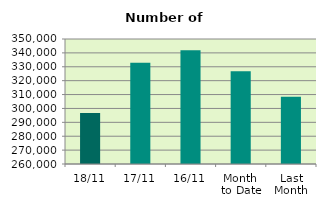
| Category | Series 0 |
|---|---|
| 18/11 | 296660 |
| 17/11 | 332924 |
| 16/11 | 341826 |
| Month 
to Date | 326771.143 |
| Last
Month | 308508.19 |